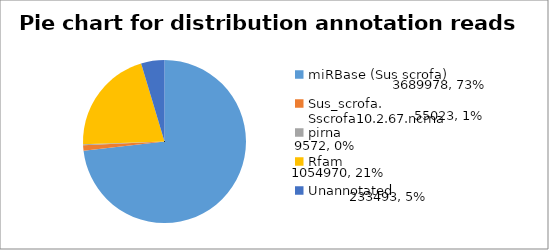
| Category | Series 0 |
|---|---|
| miRBase (Sus scrofa) | 3689978 |
| Sus_scrofa. Sscrofa10.2.67.ncrna | 55023 |
| pirna | 9572 |
| Rfam | 1054970 |
| Unannotated  | 233493 |